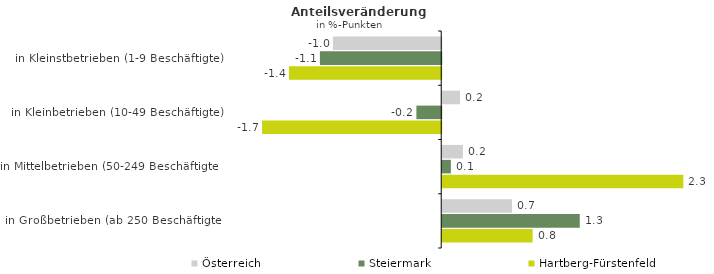
| Category | Österreich | Steiermark | Hartberg-Fürstenfeld |
|---|---|---|---|
| in Kleinstbetrieben (1-9 Beschäftigte) | -1.011 | -1.133 | -1.422 |
| in Kleinbetrieben (10-49 Beschäftigte) | 0.167 | -0.232 | -1.673 |
| in Mittelbetrieben (50-249 Beschäftigte) | 0.193 | 0.081 | 2.251 |
| in Großbetrieben (ab 250 Beschäftigte) | 0.651 | 1.284 | 0.844 |